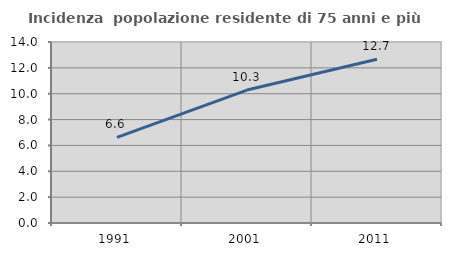
| Category | Incidenza  popolazione residente di 75 anni e più |
|---|---|
| 1991.0 | 6.624 |
| 2001.0 | 10.282 |
| 2011.0 | 12.671 |